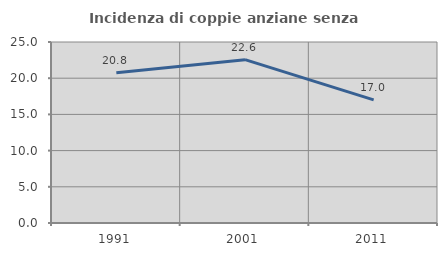
| Category | Incidenza di coppie anziane senza figli  |
|---|---|
| 1991.0 | 20.76 |
| 2001.0 | 22.559 |
| 2011.0 | 17.014 |